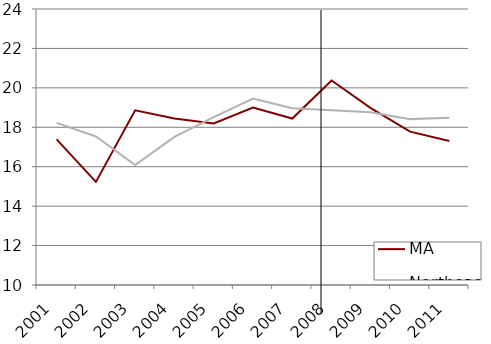
| Category | MA | Northeast |
|---|---|---|
| 2001.0 | 17.389 | 18.225 |
| 2002.0 | 15.232 | 17.533 |
| 2003.0 | 18.858 | 16.085 |
| 2004.0 | 18.447 | 17.511 |
| 2005.0 | 18.194 | 18.513 |
| 2006.0 | 19.005 | 19.453 |
| 2007.0 | 18.442 | 18.97 |
| 2008.0 | 20.37 | 18.858 |
| 2009.0 | 18.971 | 18.76 |
| 2010.0 | 17.781 | 18.414 |
| 2011.0 | 17.303 | 18.49 |